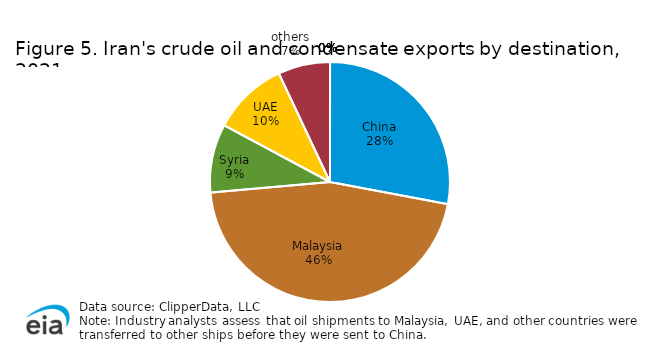
| Category | Series 0 |
|---|---|
| China | 170.209 |
| Malaysia | 277.872 |
| Syria | 56.26 |
| UAE | 61.833 |
| others | 42.67 |